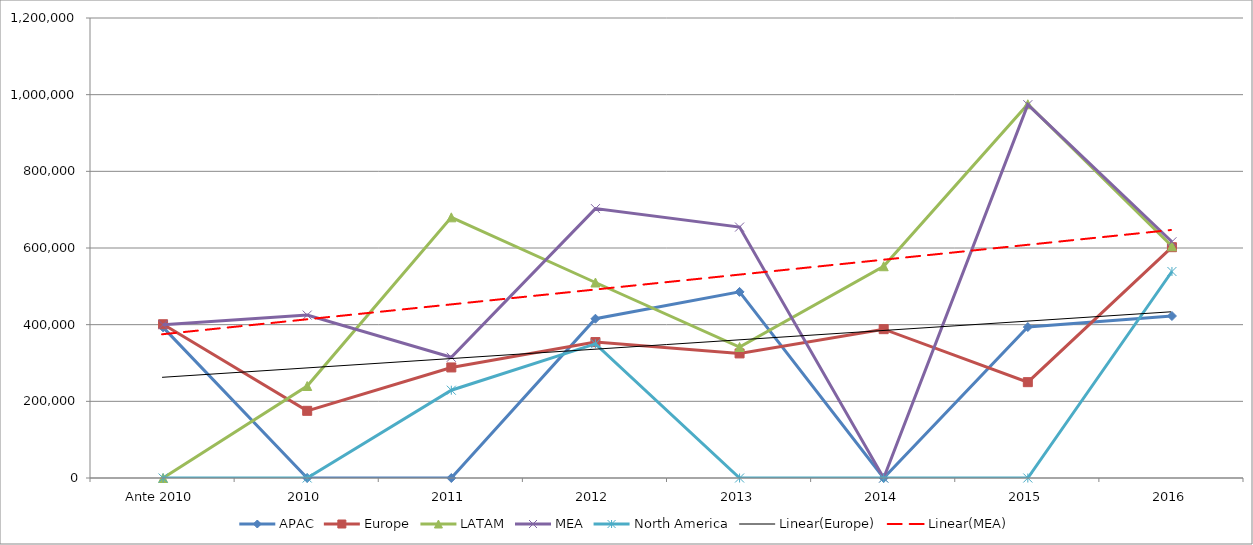
| Category | APAC | Europe | LATAM | MEA | North America |
|---|---|---|---|---|---|
| Ante 2010 | 393000 | 401125 | 0 | 400000 | 0 |
| 2010 | 0 | 175266.667 | 240000 | 425000 | 0 |
| 2011 | 0 | 288400 | 680000 | 315000 | 229000 |
| 2012 | 415500 | 354600 | 510000 | 702750 | 350000 |
| 2013 | 485494 | 325000 | 341703 | 654600 | 0 |
| 2014 | 0 | 388250 | 552407.143 | 0 | 0 |
| 2015 | 393757.25 | 250000 | 975000 | 973848.5 | 0 |
| 2016 | 422591.936 | 602133.215 | 604516.181 | 616226.444 | 538666.42 |